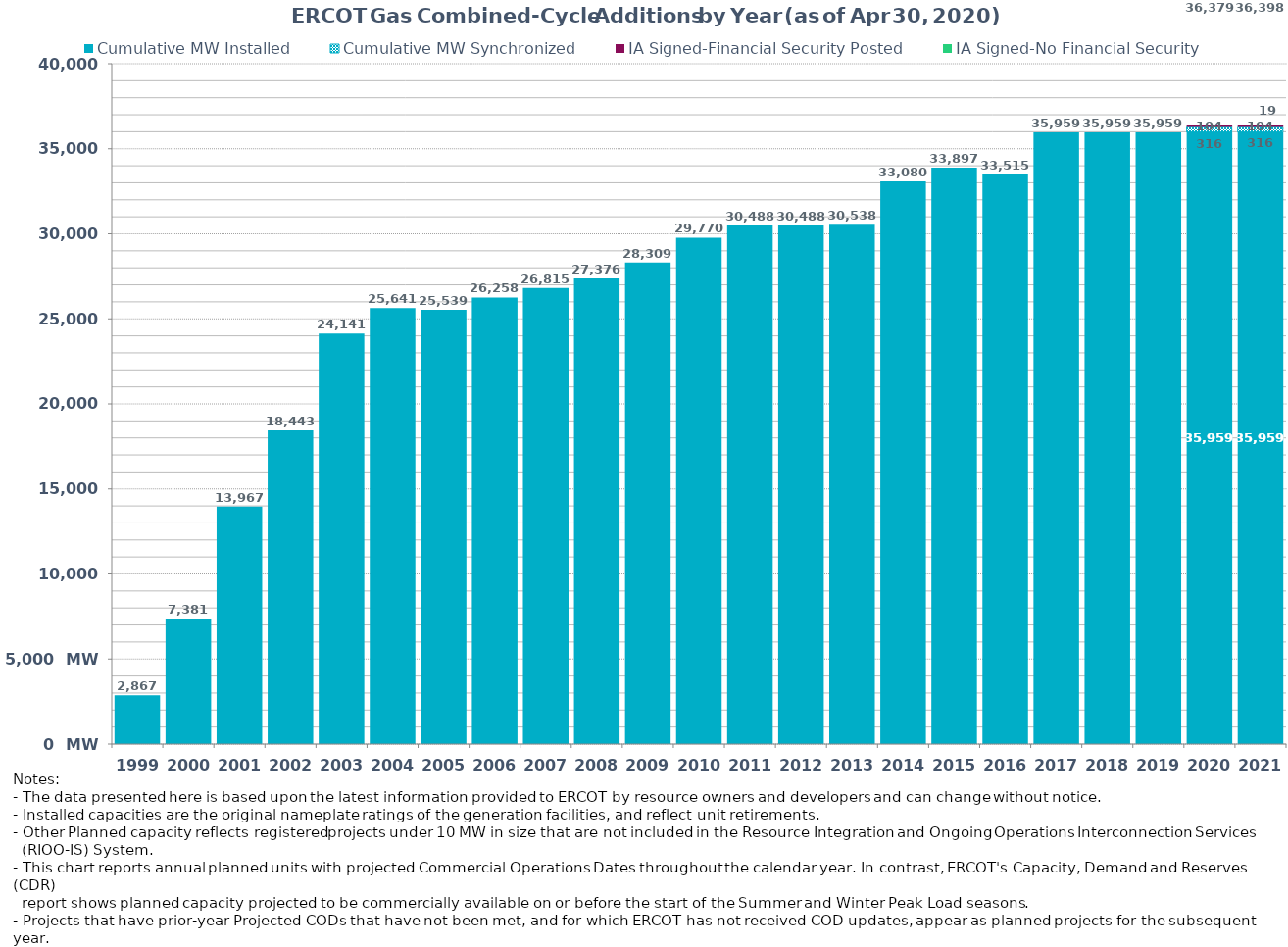
| Category | Cumulative MW Installed | Cumulative MW Synchronized | IA Signed-Financial Security Posted  | IA Signed-No Financial Security  | Other Planned | Cumulative Installed and Planned |
|---|---|---|---|---|---|---|
| 1999.0 | 2867 | 0 | 0 | 0 | 0 | 2867 |
| 2000.0 | 7381 | 0 | 0 | 0 | 0 | 7381 |
| 2001.0 | 13967 | 0 | 0 | 0 | 0 | 13967 |
| 2002.0 | 18443 | 0 | 0 | 0 | 0 | 18443 |
| 2003.0 | 24141 | 0 | 0 | 0 | 0 | 24141 |
| 2004.0 | 25641 | 0 | 0 | 0 | 0 | 25641 |
| 2005.0 | 25539 | 0 | 0 | 0 | 0 | 25539 |
| 2006.0 | 26258 | 0 | 0 | 0 | 0 | 26258 |
| 2007.0 | 26815 | 0 | 0 | 0 | 0 | 26815 |
| 2008.0 | 27376 | 0 | 0 | 0 | 0 | 27376 |
| 2009.0 | 28309 | 0 | 0 | 0 | 0 | 28309 |
| 2010.0 | 29770 | 0 | 0 | 0 | 0 | 29770 |
| 2011.0 | 30488 | 0 | 0 | 0 | 0 | 30488 |
| 2012.0 | 30488 | 0 | 0 | 0 | 0 | 30488 |
| 2013.0 | 30538 | 0 | 0 | 0 | 0 | 30538 |
| 2014.0 | 33080 | 0 | 0 | 0 | 0 | 33080 |
| 2015.0 | 33897 | 0 | 0 | 0 | 0 | 33897 |
| 2016.0 | 33515 | 0 | 0 | 0 | 0 | 33515 |
| 2017.0 | 35959.34 | 0 | 0 | 0 | 0 | 35959.34 |
| 2018.0 | 35959.34 | 0 | 0 | 0 | 0 | 35959.34 |
| 2019.0 | 35959.34 | 0 | 0 | 0 | 0 | 35959.34 |
| 2020.0 | 35959.34 | 316 | 104 | 0 | 0 | 36379.34 |
| 2021.0 | 35959.34 | 316 | 104 | 19 | 0 | 36398.34 |